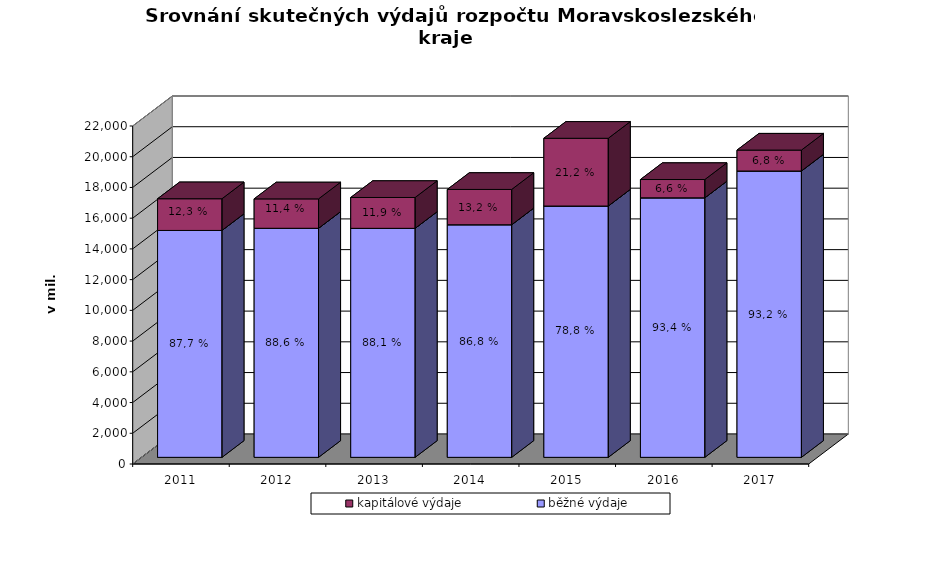
| Category | běžné výdaje | kapitálové výdaje |
|---|---|---|
| 2011.0 | 14769.003 | 2062.28 |
| 2012.0 | 14909.261 | 1912.375 |
| 2013.0 | 14904.712 | 2009.296 |
| 2014.0 | 15138.14 | 2299.407 |
| 2015.0 | 16356.738 | 4409.991 |
| 2016.0 | 16889.752 | 1192.562 |
| 2017.0 | 18636.111 | 1361.573 |